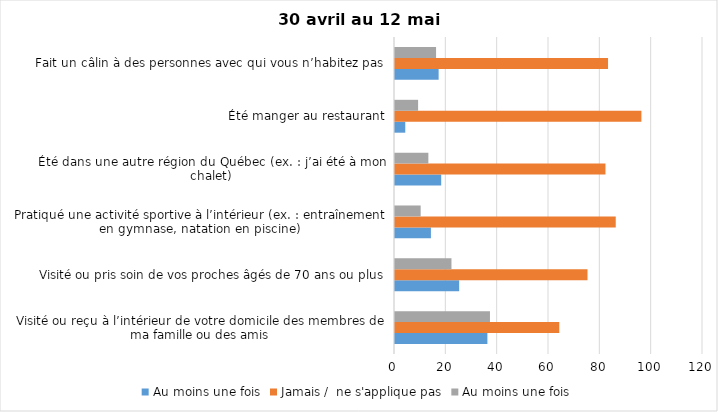
| Category | Au moins une fois | Jamais /  ne s'applique pas |
|---|---|---|
| Visité ou reçu à l’intérieur de votre domicile des membres de ma famille ou des amis | 37 | 64 |
| Visité ou pris soin de vos proches âgés de 70 ans ou plus | 22 | 75 |
| Pratiqué une activité sportive à l’intérieur (ex. : entraînement en gymnase, natation en piscine) | 10 | 86 |
| Été dans une autre région du Québec (ex. : j’ai été à mon chalet) | 13 | 82 |
| Été manger au restaurant | 9 | 96 |
| Fait un câlin à des personnes avec qui vous n’habitez pas | 16 | 83 |